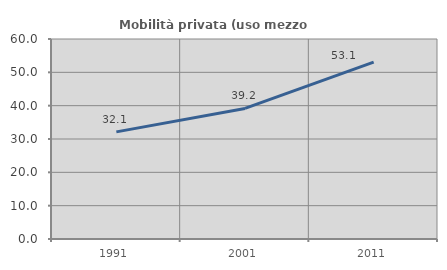
| Category | Mobilità privata (uso mezzo privato) |
|---|---|
| 1991.0 | 32.143 |
| 2001.0 | 39.167 |
| 2011.0 | 53.086 |